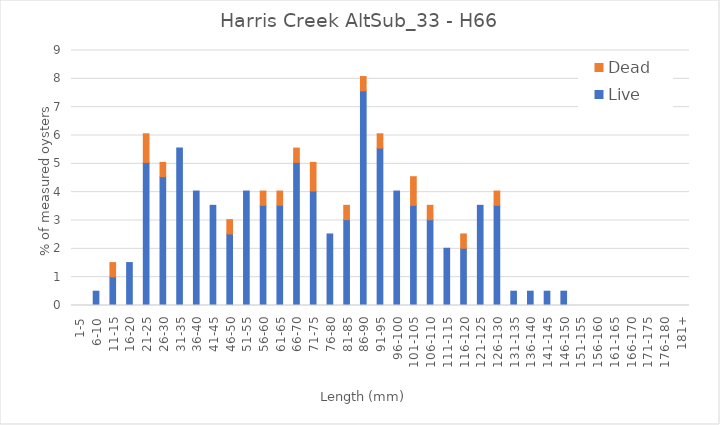
| Category | Live | Dead |
|---|---|---|
| 1-5 | 0 | 0 |
| 6-10 | 0.505 | 0 |
| 11-15 | 1.01 | 0.505 |
| 16-20 | 1.515 | 0 |
| 21-25 | 5.051 | 1.01 |
| 26-30 | 4.545 | 0.505 |
| 31-35 | 5.556 | 0 |
| 36-40 | 4.04 | 0 |
| 41-45 | 3.535 | 0 |
| 46-50 | 2.525 | 0.505 |
| 51-55 | 4.04 | 0 |
| 56-60 | 3.535 | 0.505 |
| 61-65 | 3.535 | 0.505 |
| 66-70 | 5.051 | 0.505 |
| 71-75 | 4.04 | 1.01 |
| 76-80 | 2.525 | 0 |
| 81-85 | 3.03 | 0.505 |
| 86-90 | 7.576 | 0.505 |
| 91-95 | 5.556 | 0.505 |
| 96-100 | 4.04 | 0 |
| 101-105 | 3.535 | 1.01 |
| 106-110 | 3.03 | 0.505 |
| 111-115 | 2.02 | 0 |
| 116-120 | 2.02 | 0.505 |
| 121-125 | 3.535 | 0 |
| 126-130 | 3.535 | 0.505 |
| 131-135 | 0.505 | 0 |
| 136-140 | 0.505 | 0 |
| 141-145 | 0.505 | 0 |
| 146-150 | 0.505 | 0 |
| 151-155 | 0 | 0 |
| 156-160 | 0 | 0 |
| 161-165 | 0 | 0 |
| 166-170 | 0 | 0 |
| 171-175 | 0 | 0 |
| 176-180 | 0 | 0 |
| 181+ | 0 | 0 |